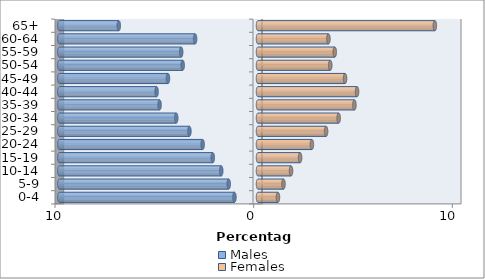
| Category | Males | Females |
|---|---|---|
| 0-4 | -1.186 | 1.005 |
| 5-9 | -1.475 | 1.282 |
| 10-14 | -1.851 | 1.663 |
| 15-19 | -2.276 | 2.119 |
| 20-24 | -2.786 | 2.712 |
| 25-29 | -3.453 | 3.428 |
| 30-34 | -4.115 | 4.061 |
| 35-39 | -4.954 | 4.854 |
| 40-44 | -5.104 | 4.986 |
| 45-49 | -4.531 | 4.381 |
| 50-54 | -3.791 | 3.636 |
| 55-59 | -3.867 | 3.862 |
| 60-64 | -3.166 | 3.545 |
| 65+ | -7.009 | 8.902 |